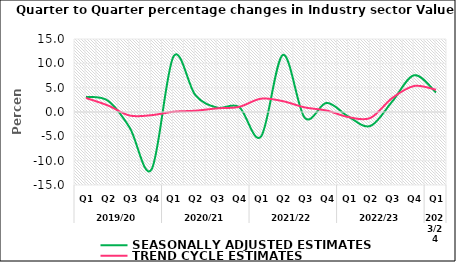
| Category | SEASONALLY ADJUSTED ESTIMATES | TREND CYCLE ESTIMATES |
|---|---|---|
| 0 | 3.114 | 2.882 |
| 1 | 2.336 | 1.349 |
| 2 | -3.216 | -0.728 |
| 3 | -11.789 | -0.648 |
| 4 | 11.403 | 0.049 |
| 5 | 3.468 | 0.262 |
| 6 | 0.895 | 0.75 |
| 7 | 1.028 | 1.055 |
| 8 | -5.045 | 2.733 |
| 9 | 11.731 | 2.223 |
| 10 | -1.201 | 0.944 |
| 11 | 1.875 | 0.298 |
| 12 | -0.966 | -1.052 |
| 13 | -2.867 | -1.222 |
| 14 | 2.18 | 2.887 |
| 15 | 7.556 | 5.346 |
| 16 | 4.014 | 4.564 |